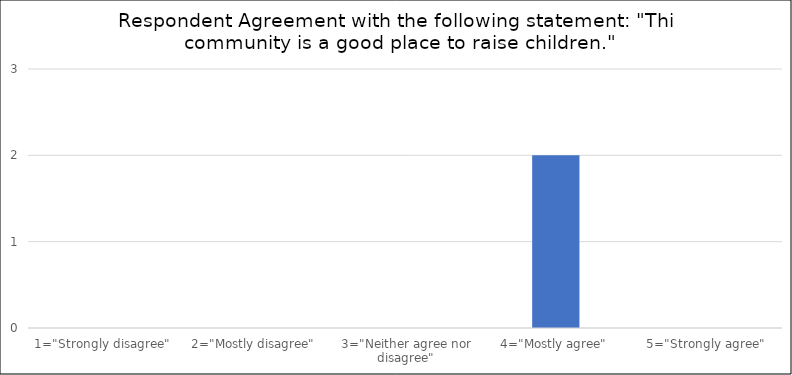
| Category | Number of Responses |
|---|---|
| 1="Strongly disagree" | 0 |
| 2="Mostly disagree" | 0 |
| 3="Neither agree nor disagree" | 0 |
| 4="Mostly agree" | 2 |
| 5="Strongly agree" | 0 |